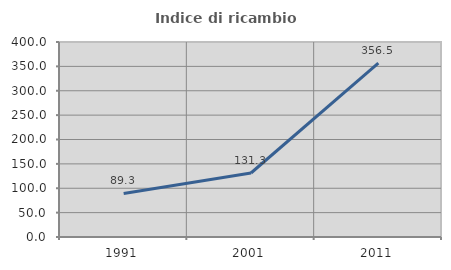
| Category | Indice di ricambio occupazionale  |
|---|---|
| 1991.0 | 89.299 |
| 2001.0 | 131.304 |
| 2011.0 | 356.522 |